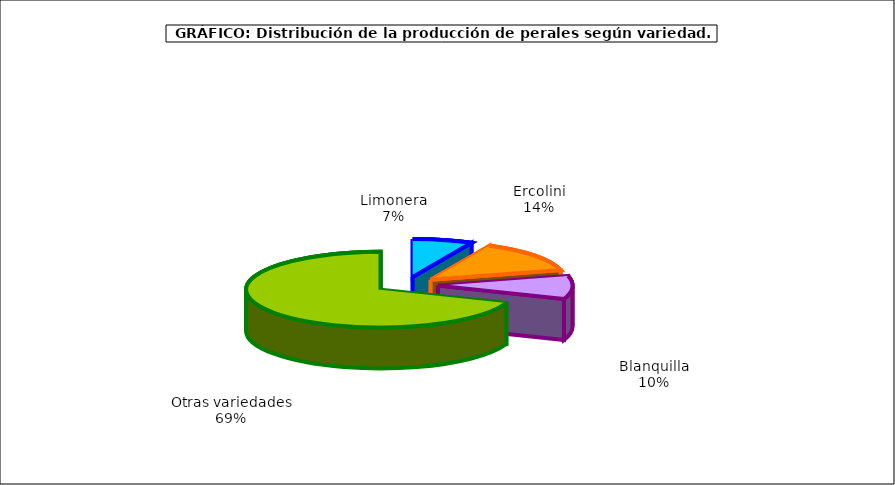
| Category | produccion |
|---|---|
| 0 | 23.358 |
| 1 | 44.289 |
| 2 | 31.938 |
| 3 | 224.464 |